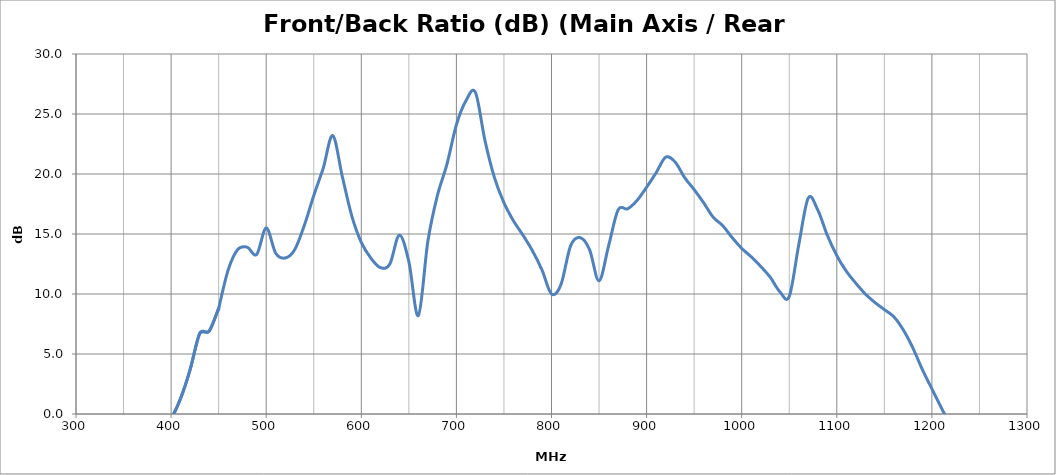
| Category | Front/Back Ratio (dB) |
|---|---|
| 300.0 | -9.3 |
| 310.0 | -11.9 |
| 320.0 | -8.8 |
| 330.0 | -5.1 |
| 340.0 | -4 |
| 350.0 | -3.5 |
| 360.0 | -2.7 |
| 370.0 | -0.9 |
| 380.0 | -0.2 |
| 390.0 | -1.5 |
| 400.0 | -0.4 |
| 410.0 | 1.3 |
| 420.0 | 3.7 |
| 430.0 | 6.7 |
| 440.0 | 6.9 |
| 450.0 | 8.8 |
| 460.0 | 12 |
| 470.0 | 13.7 |
| 480.0 | 13.9 |
| 490.0 | 13.3 |
| 500.0 | 15.5 |
| 510.0 | 13.4 |
| 520.0 | 13 |
| 530.0 | 13.7 |
| 540.0 | 15.7 |
| 550.0 | 18.2 |
| 560.0 | 20.5 |
| 570.0 | 23.2 |
| 580.0 | 19.8 |
| 590.0 | 16.5 |
| 600.0 | 14.3 |
| 610.0 | 13 |
| 620.0 | 12.2 |
| 630.0 | 12.5 |
| 640.0 | 14.9 |
| 650.0 | 12.7 |
| 660.0 | 8.2 |
| 670.0 | 14.4 |
| 680.0 | 18.2 |
| 690.0 | 20.8 |
| 700.0 | 24.1 |
| 710.0 | 26.1 |
| 720.0 | 26.8 |
| 730.0 | 22.8 |
| 740.0 | 19.7 |
| 750.0 | 17.6 |
| 760.0 | 16.1 |
| 770.0 | 14.9 |
| 780.0 | 13.6 |
| 790.0 | 12 |
| 800.0 | 10 |
| 810.0 | 10.8 |
| 820.0 | 14 |
| 830.0 | 14.7 |
| 840.0 | 13.7 |
| 850.0 | 11.1 |
| 860.0 | 14 |
| 870.0 | 17 |
| 880.0 | 17.1 |
| 890.0 | 17.8 |
| 900.0 | 18.9 |
| 910.0 | 20.1 |
| 920.0 | 21.4 |
| 930.0 | 21 |
| 940.0 | 19.7 |
| 950.0 | 18.7 |
| 960.0 | 17.6 |
| 970.0 | 16.4 |
| 980.0 | 15.7 |
| 990.0 | 14.7 |
| 1000.0 | 13.8 |
| 1010.0 | 13.1 |
| 1020.0 | 12.3 |
| 1030.0 | 11.4 |
| 1040.0 | 10.2 |
| 1050.0 | 9.8 |
| 1060.0 | 14.1 |
| 1070.0 | 18 |
| 1080.0 | 17 |
| 1090.0 | 14.9 |
| 1100.0 | 13.2 |
| 1110.0 | 11.9 |
| 1120.0 | 10.9 |
| 1130.0 | 10 |
| 1140.0 | 9.3 |
| 1150.0 | 8.7 |
| 1160.0 | 8.1 |
| 1170.0 | 7 |
| 1180.0 | 5.5 |
| 1190.0 | 3.7 |
| 1200.0 | 2.1 |
| 1210.0 | 0.5 |
| 1220.0 | -1 |
| 1230.0 | -2.5 |
| 1240.0 | -3.9 |
| 1250.0 | -4.6 |
| 1260.0 | -5.6 |
| 1270.0 | -6.8 |
| 1280.0 | -8.2 |
| 1290.0 | -9.8 |
| 1300.0 | -11 |